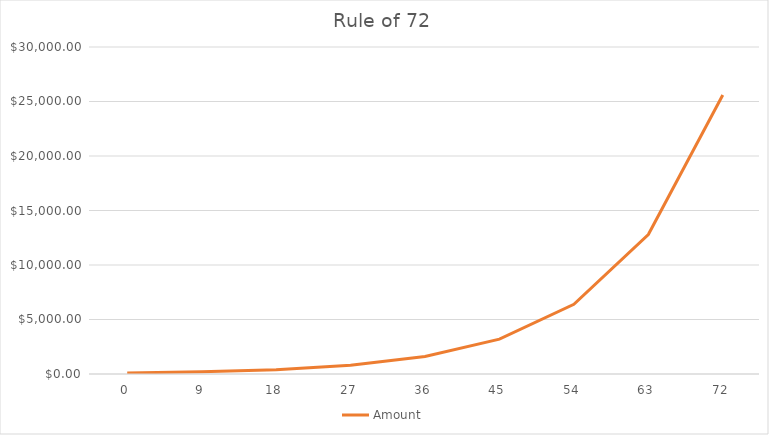
| Category | Amount |
|---|---|
| 0.0 | 100 |
| 9.0 | 200 |
| 18.0 | 400 |
| 27.0 | 800 |
| 36.0 | 1600 |
| 45.0 | 3200 |
| 54.0 | 6400 |
| 63.0 | 12800 |
| 72.0 | 25600 |